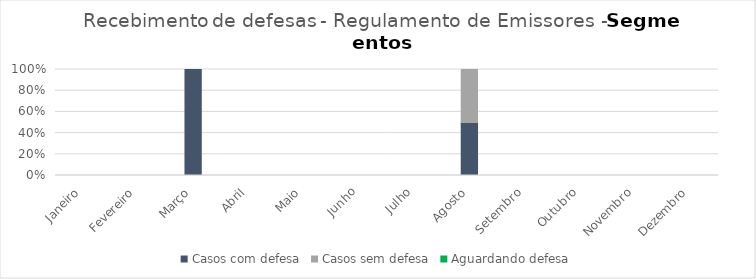
| Category | Casos com defesa | Casos sem defesa | Aguardando defesa |
|---|---|---|---|
| Janeiro | 0 | 0 | 0 |
| Fevereiro | 0 | 0 | 0 |
| Março | 2 | 0 | 0 |
| Abril | 0 | 0 | 0 |
| Maio | 0 | 0 | 0 |
| Junho | 0 | 0 | 0 |
| Julho | 0 | 0 | 0 |
| Agosto | 1 | 1 | 0 |
| Setembro | 0 | 0 | 0 |
| Outubro | 0 | 0 | 0 |
| Novembro | 0 | 0 | 0 |
| Dezembro | 0 | 0 | 0 |